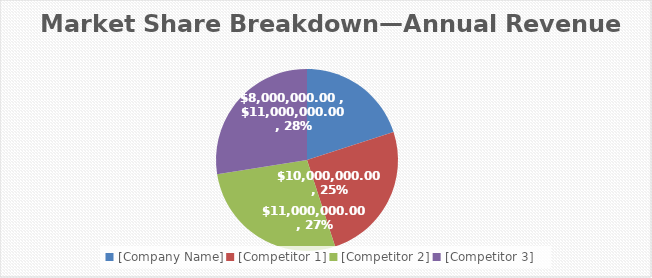
| Category | Series 1 |
|---|---|
| [Company Name] | 8000000 |
| [Competitor 1] | 10000000 |
| [Competitor 2] | 11000000 |
| [Competitor 3] | 11000000 |